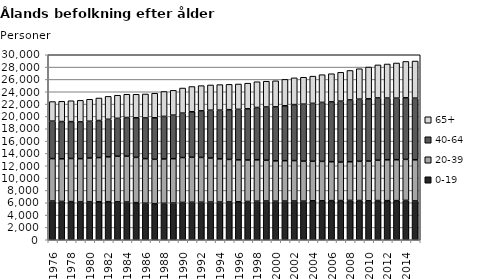
| Category | 0-19 | 20-39 | 40-64 | 65+ |
|---|---|---|---|---|
| 1976.0 | 6281 | 6877 | 6077 | 3178 |
| 1977.0 | 6217 | 6911 | 6041 | 3283 |
| 1978.0 | 6186 | 6992 | 5979 | 3385 |
| 1979.0 | 6132 | 7018 | 5959 | 3499 |
| 1980.0 | 6137 | 7116 | 5965 | 3565 |
| 1981.0 | 6159 | 7167 | 6007 | 3651 |
| 1982.0 | 6174 | 7271 | 6086 | 3720 |
| 1983.0 | 6148 | 7405 | 6136 | 3746 |
| 1984.0 | 6114 | 7443 | 6264 | 3774 |
| 1985.0 | 6019 | 7340 | 6426 | 3806 |
| 1986.0 | 5927 | 7226 | 6599 | 3888 |
| 1987.0 | 5851 | 7195 | 6735 | 3980 |
| 1988.0 | 5907 | 7198 | 6899 | 4041 |
| 1989.0 | 5947 | 7199 | 7063 | 4022 |
| 1990.0 | 6056 | 7279 | 7198 | 4071 |
| 1991.0 | 6083 | 7297 | 7379 | 4088 |
| 1992.0 | 6086 | 7269 | 7545 | 4093 |
| 1993.0 | 6111 | 7145 | 7747 | 4099 |
| 1994.0 | 6119 | 6999 | 7896 | 4144 |
| 1995.0 | 6135 | 6892 | 8069 | 4106 |
| 1996.0 | 6160 | 6796 | 8196 | 4105 |
| 1997.0 | 6210 | 6722 | 8302 | 4158 |
| 1998.0 | 6251 | 6708 | 8489 | 4177 |
| 1999.0 | 6282 | 6614 | 8633 | 4177 |
| 2000.0 | 6253 | 6542 | 8757 | 4224 |
| 2001.0 | 6273 | 6549 | 8906 | 4280 |
| 2002.0 | 6282 | 6559 | 9080 | 4336 |
| 2003.0 | 6260 | 6494 | 9232 | 4361 |
| 2004.0 | 6319 | 6409 | 9391 | 4411 |
| 2005.0 | 6315 | 6394 | 9563 | 4494 |
| 2006.0 | 6343 | 6310 | 9707 | 4563 |
| 2007.0 | 6352 | 6237 | 9887 | 4677 |
| 2008.0 | 6379 | 6268 | 10030 | 4779 |
| 2009.0 | 6361 | 6364 | 10076 | 4933 |
| 2010.0 | 6314 | 6448 | 10100 | 5145 |
| 2011.0 | 6358 | 6546 | 10093 | 5358 |
| 2012.0 | 6341 | 6622 | 10012 | 5527 |
| 2013.0 | 6345 | 6634 | 9982 | 5705 |
| 2014.0 | 6385 | 6649 | 9983 | 5899 |
| 2015.0 | 6289 | 6674 | 9997 | 6023 |